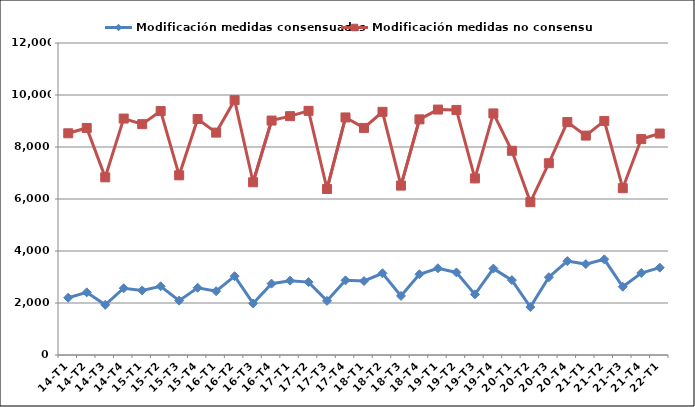
| Category | Modificación medidas consensuadas | Modificación medidas no consensuadas |
|---|---|---|
| 14-T1 | 2203 | 8527 |
| 14-T2 | 2411 | 8733 |
| 14-T3 | 1929 | 6834 |
| 14-T4 | 2567 | 9094 |
| 15-T1 | 2483 | 8879 |
| 15-T2 | 2644 | 9382 |
| 15-T3 | 2092 | 6911 |
| 15-T4 | 2586 | 9076 |
| 16-T1 | 2455 | 8554 |
| 16-T2 | 3032 | 9802 |
| 16-T3 | 1983 | 6644 |
| 16-T4 | 2744 | 9017 |
| 17-T1 | 2859 | 9186 |
| 17-T2 | 2804 | 9391 |
| 17-T3 | 2082 | 6385 |
| 17-T4 | 2872 | 9137 |
| 18-T1 | 2846 | 8734 |
| 18-T2 | 3144 | 9353 |
| 18-T3 | 2272 | 6516 |
| 18-T4 | 3104 | 9063 |
| 19-T1 | 3335 | 9440 |
| 19-T2 | 3176 | 9426 |
| 19-T3 | 2332 | 6792 |
| 19-T4 | 3323 | 9291 |
| 20-T1 | 2880 | 7854 |
| 20-T2 | 1846 | 5880 |
| 20-T3 | 2991 | 7376 |
| 20-T4 | 3612 | 8960 |
| 21-T1 | 3496 | 8439 |
| 21-T2 | 3680 | 9003 |
| 21-T3 | 2625 | 6416 |
| 21-T4 | 3154 | 8304 |
| 22-T1 | 3359 | 8518 |